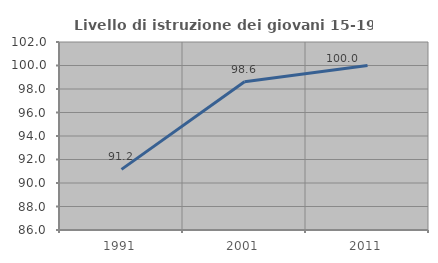
| Category | Livello di istruzione dei giovani 15-19 anni |
|---|---|
| 1991.0 | 91.16 |
| 2001.0 | 98.621 |
| 2011.0 | 100 |